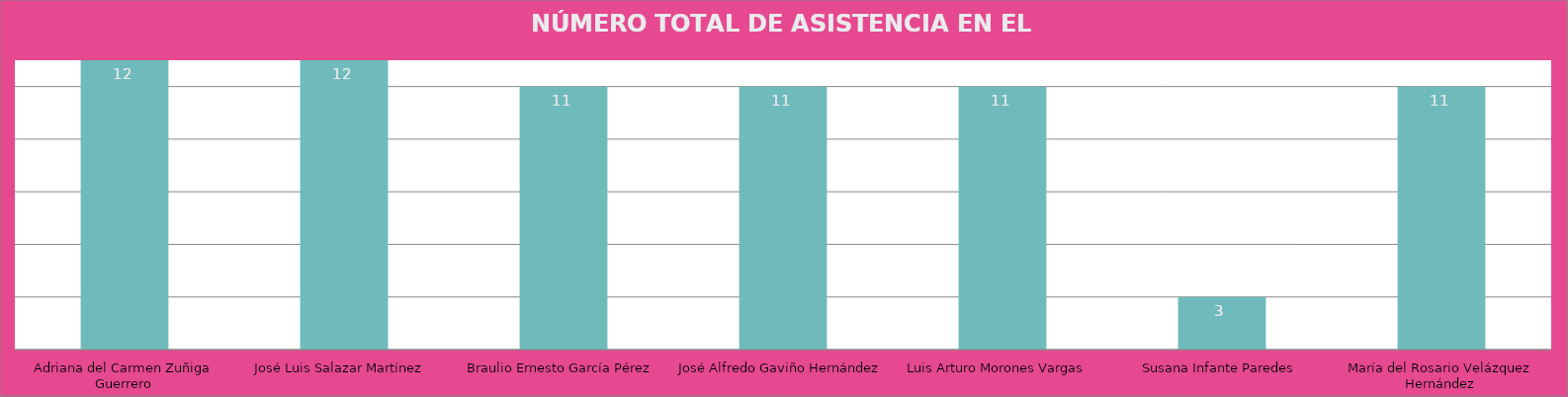
| Category | Adriana del Carmen Zuñiga Guerrero |
|---|---|
| Adriana del Carmen Zuñiga Guerrero | 12 |
| José Luis Salazar Martínez  | 12 |
| Braulio Ernesto García Pérez | 11 |
| José Alfredo Gaviño Hernández | 11 |
| Luis Arturo Morones Vargas  | 11 |
| Susana Infante Paredes | 3 |
| María del Rosario Velázquez Hernández | 11 |